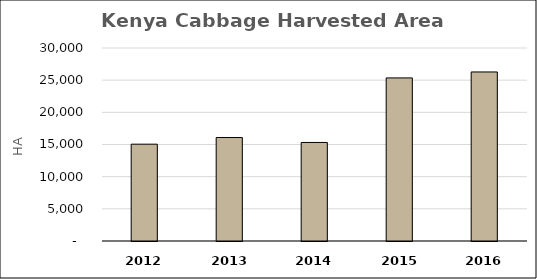
| Category | Series 0 |
|---|---|
| 2012 | 15051 |
| 2013 | 16084.12 |
| 2014 | 15317.7 |
| 2015 | 25349 |
| 2016 | 26275.65 |